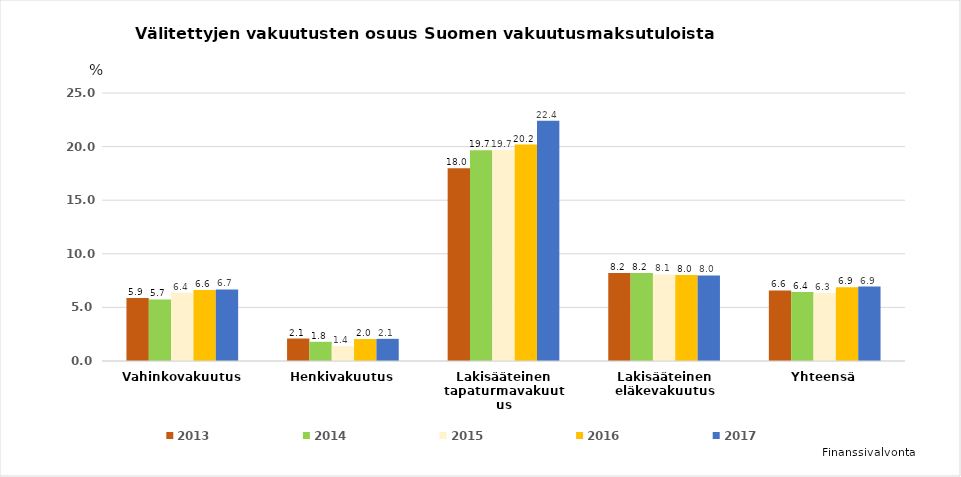
| Category | 2013 | 2014 | 2015 | 2016 | 2017 |
|---|---|---|---|---|---|
| Vahinkovakuutus | 5.882 | 5.737 | 6.356 | 6.621 | 6.681 |
| Henkivakuutus | 2.097 | 1.791 | 1.39 | 2.047 | 2.067 |
| Lakisääteinen tapaturmavakuutus | 17.98 | 19.654 | 19.692 | 20.194 | 22.408 |
| Lakisääteinen eläkevakuutus | 8.204 | 8.203 | 8.075 | 8.016 | 7.982 |
| Yhteensä | 6.584 | 6.436 | 6.337 | 6.875 | 6.948 |